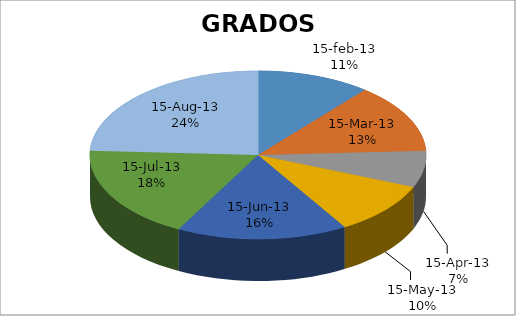
| Category | Series 0 |
|---|---|
| 41320.0 | 14 |
| 41390.0 | 17 |
| 41432.0 | 9 |
| 41467.0 | 13 |
| 41529.0 | 21 |
| 41572.0 | 23 |
| 41620.0 | 31 |